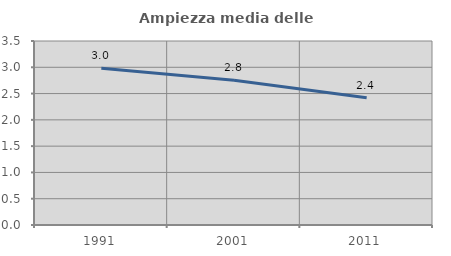
| Category | Ampiezza media delle famiglie |
|---|---|
| 1991.0 | 2.981 |
| 2001.0 | 2.752 |
| 2011.0 | 2.419 |